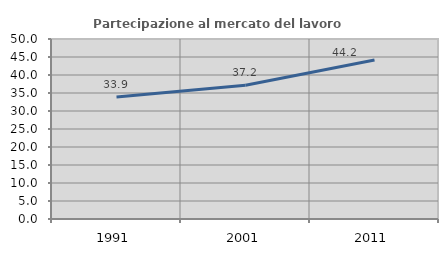
| Category | Partecipazione al mercato del lavoro  femminile |
|---|---|
| 1991.0 | 33.906 |
| 2001.0 | 37.16 |
| 2011.0 | 44.174 |